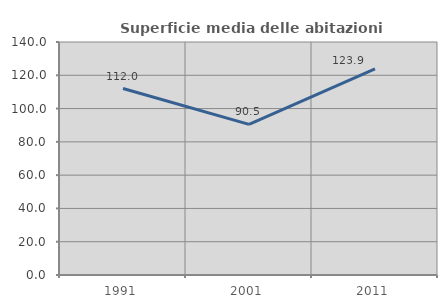
| Category | Superficie media delle abitazioni occupate |
|---|---|
| 1991.0 | 112.042 |
| 2001.0 | 90.528 |
| 2011.0 | 123.885 |